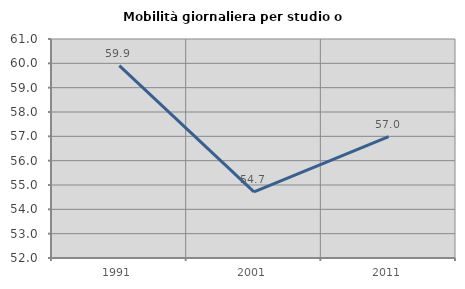
| Category | Mobilità giornaliera per studio o lavoro |
|---|---|
| 1991.0 | 59.905 |
| 2001.0 | 54.721 |
| 2011.0 | 56.987 |